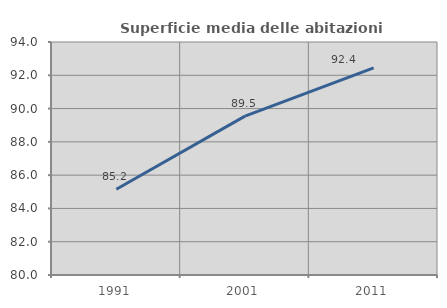
| Category | Superficie media delle abitazioni occupate |
|---|---|
| 1991.0 | 85.156 |
| 2001.0 | 89.544 |
| 2011.0 | 92.447 |